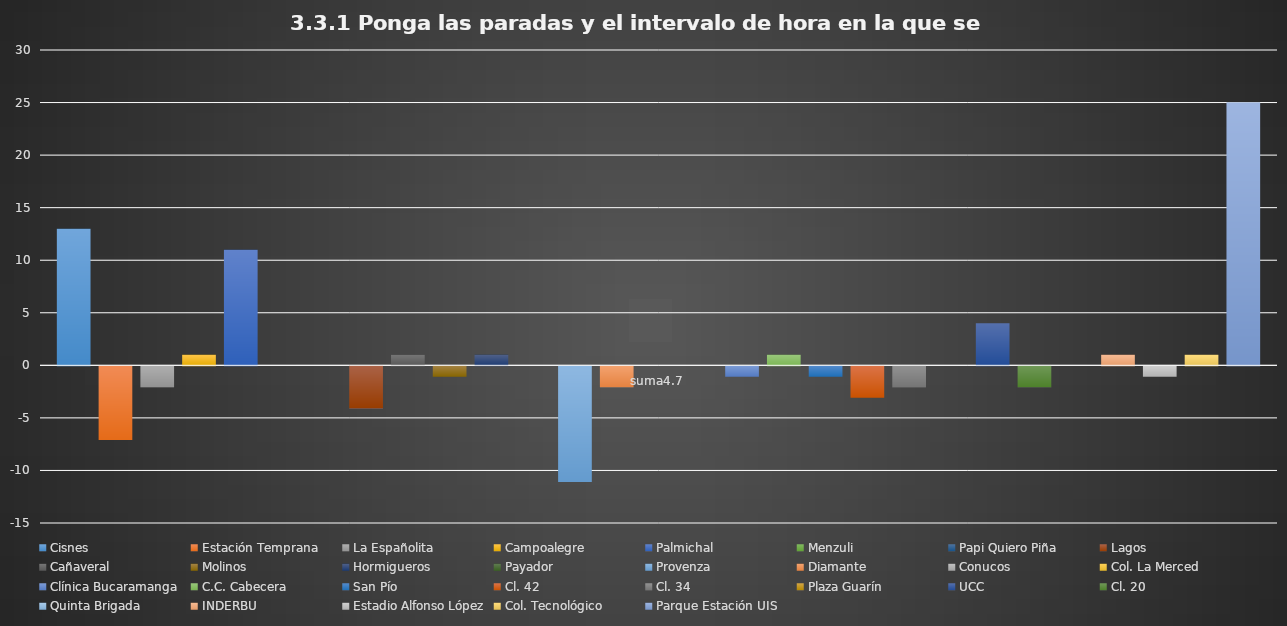
| Category | Cisnes | Estación Temprana | La Españolita | Campoalegre | Palmichal | Menzuli | Papi Quiero Piña | Lagos | Cañaveral | Molinos | Hormigueros | Payador | Provenza | Diamante | Conucos | Col. La Merced | Clínica Bucaramanga | C.C. Cabecera | San Pío | Cl. 42 | Cl. 34 | Plaza Guarín | UCC | Cl. 20 | Quinta Brigada | INDERBU | Estadio Alfonso López | Col. Tecnológico | Parque Estación UIS |
|---|---|---|---|---|---|---|---|---|---|---|---|---|---|---|---|---|---|---|---|---|---|---|---|---|---|---|---|---|---|
| suma4.7 | 13 | -7 | -2 | 1 | 11 | 0 | 0 | -4 | 1 | -1 | 1 | 0 | -11 | -2 | 0 | 0 | -1 | 1 | -1 | -3 | -2 | 0 | 4 | -2 | 0 | 1 | -1 | 1 | 25 |